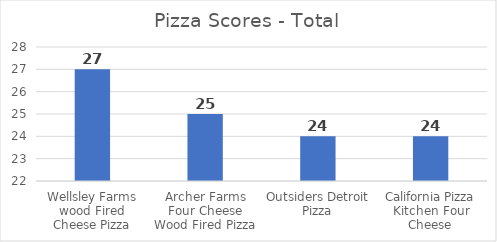
| Category | Series 0 |
|---|---|
| Wellsley Farms wood Fired Cheese Pizza | 27 |
| Archer Farms Four Cheese Wood Fired Pizza | 25 |
| Outsiders Detroit Pizza | 24 |
| California Pizza Kitchen Four Cheese | 24 |